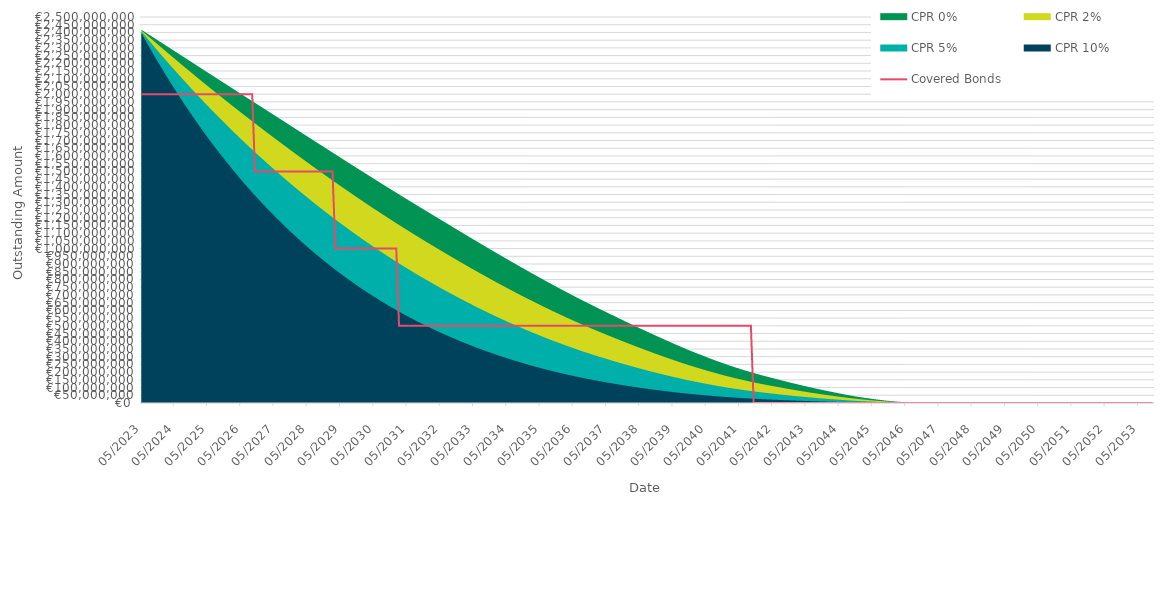
| Category | Covered Bonds |
|---|---|
| 2023-05-31 | 2000000000 |
| 2023-06-30 | 2000000000 |
| 2023-07-31 | 2000000000 |
| 2023-08-31 | 2000000000 |
| 2023-09-30 | 2000000000 |
| 2023-10-31 | 2000000000 |
| 2023-11-30 | 2000000000 |
| 2023-12-31 | 2000000000 |
| 2024-01-31 | 2000000000 |
| 2024-02-29 | 2000000000 |
| 2024-03-31 | 2000000000 |
| 2024-04-30 | 2000000000 |
| 2024-05-31 | 2000000000 |
| 2024-06-30 | 2000000000 |
| 2024-07-31 | 2000000000 |
| 2024-08-31 | 2000000000 |
| 2024-09-30 | 2000000000 |
| 2024-10-31 | 2000000000 |
| 2024-11-30 | 2000000000 |
| 2024-12-31 | 2000000000 |
| 2025-01-31 | 2000000000 |
| 2025-02-28 | 2000000000 |
| 2025-03-31 | 2000000000 |
| 2025-04-30 | 2000000000 |
| 2025-05-31 | 2000000000 |
| 2025-06-30 | 2000000000 |
| 2025-07-31 | 2000000000 |
| 2025-08-31 | 2000000000 |
| 2025-09-30 | 2000000000 |
| 2025-10-31 | 2000000000 |
| 2025-11-30 | 2000000000 |
| 2025-12-31 | 2000000000 |
| 2026-01-31 | 2000000000 |
| 2026-02-28 | 2000000000 |
| 2026-03-31 | 2000000000 |
| 2026-04-30 | 2000000000 |
| 2026-05-31 | 2000000000 |
| 2026-06-30 | 2000000000 |
| 2026-07-31 | 2000000000 |
| 2026-08-31 | 2000000000 |
| 2026-09-30 | 2000000000 |
| 2026-10-31 | 1500000000 |
| 2026-11-30 | 1500000000 |
| 2026-12-31 | 1500000000 |
| 2027-01-31 | 1500000000 |
| 2027-02-28 | 1500000000 |
| 2027-03-31 | 1500000000 |
| 2027-04-30 | 1500000000 |
| 2027-05-31 | 1500000000 |
| 2027-06-30 | 1500000000 |
| 2027-07-31 | 1500000000 |
| 2027-08-31 | 1500000000 |
| 2027-09-30 | 1500000000 |
| 2027-10-31 | 1500000000 |
| 2027-11-30 | 1500000000 |
| 2027-12-31 | 1500000000 |
| 2028-01-31 | 1500000000 |
| 2028-02-29 | 1500000000 |
| 2028-03-31 | 1500000000 |
| 2028-04-30 | 1500000000 |
| 2028-05-31 | 1500000000 |
| 2028-06-30 | 1500000000 |
| 2028-07-31 | 1500000000 |
| 2028-08-31 | 1500000000 |
| 2028-09-30 | 1500000000 |
| 2028-10-31 | 1500000000 |
| 2028-11-30 | 1500000000 |
| 2028-12-31 | 1500000000 |
| 2029-01-31 | 1500000000 |
| 2029-02-28 | 1500000000 |
| 2029-03-31 | 1000000000 |
| 2029-04-30 | 1000000000 |
| 2029-05-31 | 1000000000 |
| 2029-06-30 | 1000000000 |
| 2029-07-31 | 1000000000 |
| 2029-08-31 | 1000000000 |
| 2029-09-30 | 1000000000 |
| 2029-10-31 | 1000000000 |
| 2029-11-30 | 1000000000 |
| 2029-12-31 | 1000000000 |
| 2030-01-31 | 1000000000 |
| 2030-02-28 | 1000000000 |
| 2030-03-31 | 1000000000 |
| 2030-04-30 | 1000000000 |
| 2030-05-31 | 1000000000 |
| 2030-06-30 | 1000000000 |
| 2030-07-31 | 1000000000 |
| 2030-08-31 | 1000000000 |
| 2030-09-30 | 1000000000 |
| 2030-10-31 | 1000000000 |
| 2030-11-30 | 1000000000 |
| 2030-12-31 | 1000000000 |
| 2031-01-31 | 1000000000 |
| 2031-02-28 | 500000000 |
| 2031-03-31 | 500000000 |
| 2031-04-30 | 500000000 |
| 2031-05-31 | 500000000 |
| 2031-06-30 | 500000000 |
| 2031-07-31 | 500000000 |
| 2031-08-31 | 500000000 |
| 2031-09-30 | 500000000 |
| 2031-10-31 | 500000000 |
| 2031-11-30 | 500000000 |
| 2031-12-31 | 500000000 |
| 2032-01-31 | 500000000 |
| 2032-02-29 | 500000000 |
| 2032-03-31 | 500000000 |
| 2032-04-30 | 500000000 |
| 2032-05-31 | 500000000 |
| 2032-06-30 | 500000000 |
| 2032-07-31 | 500000000 |
| 2032-08-31 | 500000000 |
| 2032-09-30 | 500000000 |
| 2032-10-31 | 500000000 |
| 2032-11-30 | 500000000 |
| 2032-12-31 | 500000000 |
| 2033-01-31 | 500000000 |
| 2033-02-28 | 500000000 |
| 2033-03-31 | 500000000 |
| 2033-04-30 | 500000000 |
| 2033-05-31 | 500000000 |
| 2033-06-30 | 500000000 |
| 2033-07-31 | 500000000 |
| 2033-08-31 | 500000000 |
| 2033-09-30 | 500000000 |
| 2033-10-31 | 500000000 |
| 2033-11-30 | 500000000 |
| 2033-12-31 | 500000000 |
| 2034-01-31 | 500000000 |
| 2034-02-28 | 500000000 |
| 2034-03-31 | 500000000 |
| 2034-04-30 | 500000000 |
| 2034-05-31 | 500000000 |
| 2034-06-30 | 500000000 |
| 2034-07-31 | 500000000 |
| 2034-08-31 | 500000000 |
| 2034-09-30 | 500000000 |
| 2034-10-31 | 500000000 |
| 2034-11-30 | 500000000 |
| 2034-12-31 | 500000000 |
| 2035-01-31 | 500000000 |
| 2035-02-28 | 500000000 |
| 2035-03-31 | 500000000 |
| 2035-04-30 | 500000000 |
| 2035-05-31 | 500000000 |
| 2035-06-30 | 500000000 |
| 2035-07-31 | 500000000 |
| 2035-08-31 | 500000000 |
| 2035-09-30 | 500000000 |
| 2035-10-31 | 500000000 |
| 2035-11-30 | 500000000 |
| 2035-12-31 | 500000000 |
| 2036-01-31 | 500000000 |
| 2036-02-29 | 500000000 |
| 2036-03-31 | 500000000 |
| 2036-04-30 | 500000000 |
| 2036-05-31 | 500000000 |
| 2036-06-30 | 500000000 |
| 2036-07-31 | 500000000 |
| 2036-08-31 | 500000000 |
| 2036-09-30 | 500000000 |
| 2036-10-31 | 500000000 |
| 2036-11-30 | 500000000 |
| 2036-12-31 | 500000000 |
| 2037-01-31 | 500000000 |
| 2037-02-28 | 500000000 |
| 2037-03-31 | 500000000 |
| 2037-04-30 | 500000000 |
| 2037-05-31 | 500000000 |
| 2037-06-30 | 500000000 |
| 2037-07-31 | 500000000 |
| 2037-08-31 | 500000000 |
| 2037-09-30 | 500000000 |
| 2037-10-31 | 500000000 |
| 2037-11-30 | 500000000 |
| 2037-12-31 | 500000000 |
| 2038-01-31 | 500000000 |
| 2038-02-28 | 500000000 |
| 2038-03-31 | 500000000 |
| 2038-04-30 | 500000000 |
| 2038-05-31 | 500000000 |
| 2038-06-30 | 500000000 |
| 2038-07-31 | 500000000 |
| 2038-08-31 | 500000000 |
| 2038-09-30 | 500000000 |
| 2038-10-31 | 500000000 |
| 2038-11-30 | 500000000 |
| 2038-12-31 | 500000000 |
| 2039-01-31 | 500000000 |
| 2039-02-28 | 500000000 |
| 2039-03-31 | 500000000 |
| 2039-04-30 | 500000000 |
| 2039-05-31 | 500000000 |
| 2039-06-30 | 500000000 |
| 2039-07-31 | 500000000 |
| 2039-08-31 | 500000000 |
| 2039-09-30 | 500000000 |
| 2039-10-31 | 500000000 |
| 2039-11-30 | 500000000 |
| 2039-12-31 | 500000000 |
| 2040-01-31 | 500000000 |
| 2040-02-29 | 500000000 |
| 2040-03-31 | 500000000 |
| 2040-04-30 | 500000000 |
| 2040-05-31 | 500000000 |
| 2040-06-30 | 500000000 |
| 2040-07-31 | 500000000 |
| 2040-08-31 | 500000000 |
| 2040-09-30 | 500000000 |
| 2040-10-31 | 500000000 |
| 2040-11-30 | 500000000 |
| 2040-12-31 | 500000000 |
| 2041-01-31 | 500000000 |
| 2041-02-28 | 500000000 |
| 2041-03-31 | 500000000 |
| 2041-04-30 | 500000000 |
| 2041-05-31 | 500000000 |
| 2041-06-30 | 500000000 |
| 2041-07-31 | 500000000 |
| 2041-08-31 | 500000000 |
| 2041-09-30 | 500000000 |
| 2041-10-31 | 0 |
| 2041-11-30 | 0 |
| 2041-12-31 | 0 |
| 2042-01-31 | 0 |
| 2042-02-28 | 0 |
| 2042-03-31 | 0 |
| 2042-04-30 | 0 |
| 2042-05-31 | 0 |
| 2042-06-30 | 0 |
| 2042-07-31 | 0 |
| 2042-08-31 | 0 |
| 2042-09-30 | 0 |
| 2042-10-31 | 0 |
| 2042-11-30 | 0 |
| 2042-12-31 | 0 |
| 2043-01-31 | 0 |
| 2043-02-28 | 0 |
| 2043-03-31 | 0 |
| 2043-04-30 | 0 |
| 2043-05-31 | 0 |
| 2043-06-30 | 0 |
| 2043-07-31 | 0 |
| 2043-08-31 | 0 |
| 2043-09-30 | 0 |
| 2043-10-31 | 0 |
| 2043-11-30 | 0 |
| 2043-12-31 | 0 |
| 2044-01-31 | 0 |
| 2044-02-29 | 0 |
| 2044-03-31 | 0 |
| 2044-04-30 | 0 |
| 2044-05-31 | 0 |
| 2044-06-30 | 0 |
| 2044-07-31 | 0 |
| 2044-08-31 | 0 |
| 2044-09-30 | 0 |
| 2044-10-31 | 0 |
| 2044-11-30 | 0 |
| 2044-12-31 | 0 |
| 2045-01-31 | 0 |
| 2045-02-28 | 0 |
| 2045-03-31 | 0 |
| 2045-04-30 | 0 |
| 2045-05-31 | 0 |
| 2045-06-30 | 0 |
| 2045-07-31 | 0 |
| 2045-08-31 | 0 |
| 2045-09-30 | 0 |
| 2045-10-31 | 0 |
| 2045-11-30 | 0 |
| 2045-12-31 | 0 |
| 2046-01-31 | 0 |
| 2046-02-28 | 0 |
| 2046-03-31 | 0 |
| 2046-04-30 | 0 |
| 2046-05-31 | 0 |
| 2046-06-30 | 0 |
| 2046-07-31 | 0 |
| 2046-08-31 | 0 |
| 2046-09-30 | 0 |
| 2046-10-31 | 0 |
| 2046-11-30 | 0 |
| 2046-12-31 | 0 |
| 2047-01-31 | 0 |
| 2047-02-28 | 0 |
| 2047-03-31 | 0 |
| 2047-04-30 | 0 |
| 2047-05-31 | 0 |
| 2047-06-30 | 0 |
| 2047-07-31 | 0 |
| 2047-08-31 | 0 |
| 2047-09-30 | 0 |
| 2047-10-31 | 0 |
| 2047-11-30 | 0 |
| 2047-12-31 | 0 |
| 2048-01-31 | 0 |
| 2048-02-29 | 0 |
| 2048-03-31 | 0 |
| 2048-04-30 | 0 |
| 2048-05-31 | 0 |
| 2048-06-30 | 0 |
| 2048-07-31 | 0 |
| 2048-08-31 | 0 |
| 2048-09-30 | 0 |
| 2048-10-31 | 0 |
| 2048-11-30 | 0 |
| 2048-12-31 | 0 |
| 2049-01-31 | 0 |
| 2049-02-28 | 0 |
| 2049-03-31 | 0 |
| 2049-04-30 | 0 |
| 2049-05-31 | 0 |
| 2049-06-30 | 0 |
| 2049-07-31 | 0 |
| 2049-08-31 | 0 |
| 2049-09-30 | 0 |
| 2049-10-31 | 0 |
| 2049-11-30 | 0 |
| 2049-12-31 | 0 |
| 2050-01-31 | 0 |
| 2050-02-28 | 0 |
| 2050-03-31 | 0 |
| 2050-04-30 | 0 |
| 2050-05-31 | 0 |
| 2050-06-30 | 0 |
| 2050-07-31 | 0 |
| 2050-08-31 | 0 |
| 2050-09-30 | 0 |
| 2050-10-31 | 0 |
| 2050-11-30 | 0 |
| 2050-12-31 | 0 |
| 2051-01-31 | 0 |
| 2051-02-28 | 0 |
| 2051-03-31 | 0 |
| 2051-04-30 | 0 |
| 2051-05-31 | 0 |
| 2051-06-30 | 0 |
| 2051-07-31 | 0 |
| 2051-08-31 | 0 |
| 2051-09-30 | 0 |
| 2051-10-31 | 0 |
| 2051-11-30 | 0 |
| 2051-12-31 | 0 |
| 2052-01-31 | 0 |
| 2052-02-29 | 0 |
| 2052-03-31 | 0 |
| 2052-04-30 | 0 |
| 2052-05-31 | 0 |
| 2052-06-30 | 0 |
| 2052-07-31 | 0 |
| 2052-08-31 | 0 |
| 2052-09-30 | 0 |
| 2052-10-31 | 0 |
| 2052-11-30 | 0 |
| 2052-12-31 | 0 |
| 2053-01-31 | 0 |
| 2053-02-28 | 0 |
| 2053-03-31 | 0 |
| 2053-04-30 | 0 |
| 2053-05-31 | 0 |
| 2053-06-30 | 0 |
| 2053-07-31 | 0 |
| 2053-08-31 | 0 |
| 2053-09-30 | 0 |
| 2053-10-31 | 0 |